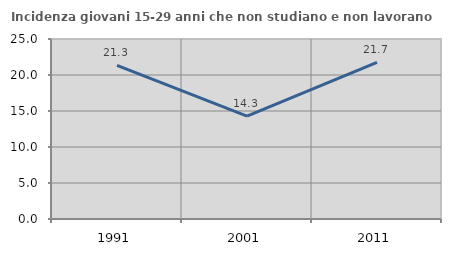
| Category | Incidenza giovani 15-29 anni che non studiano e non lavorano  |
|---|---|
| 1991.0 | 21.333 |
| 2001.0 | 14.286 |
| 2011.0 | 21.739 |